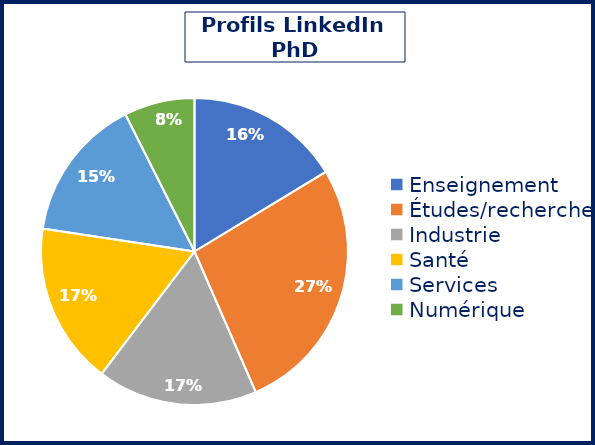
| Category | Series 0 |
|---|---|
| Enseignement | 202 |
| Études/recherche | 336 |
| Industrie | 209 |
| Santé | 211 |
| Services | 188 |
| Numérique | 92 |